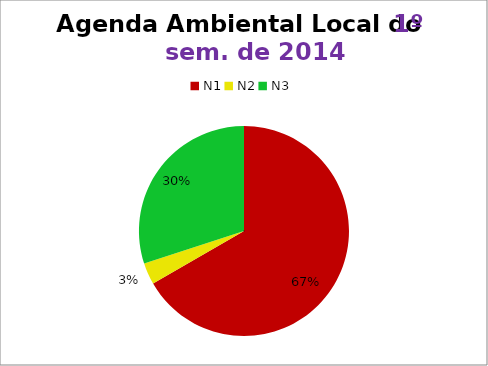
| Category | 1º/14 |
|---|---|
| N1 | 20 |
| N2 | 1 |
| N3 | 9 |